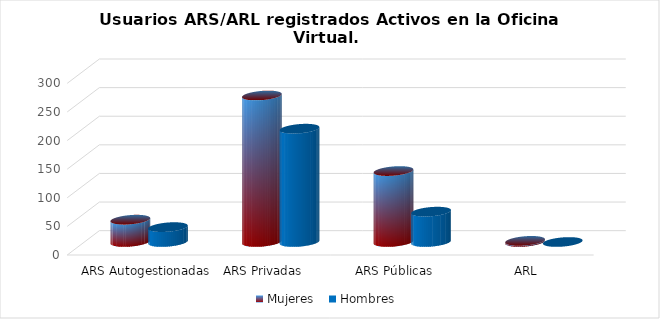
| Category | Mujeres | Hombres |
|---|---|---|
| ARS Autogestionadas | 39 | 26 |
| ARS Privadas | 256 | 198 |
| ARS Públicas | 124 | 53 |
| ARL | 2 | 0 |